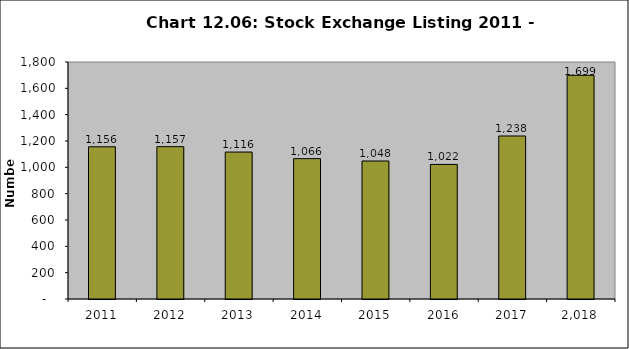
| Category | Series 0 |
|---|---|
| 2011.0 | 1156 |
| 2012.0 | 1157 |
| 2013.0 | 1116 |
| 2014.0 | 1066 |
| 2015.0 | 1048 |
| 2016.0 | 1022 |
| 2017.0 | 1238 |
| 2018.0 | 1699 |